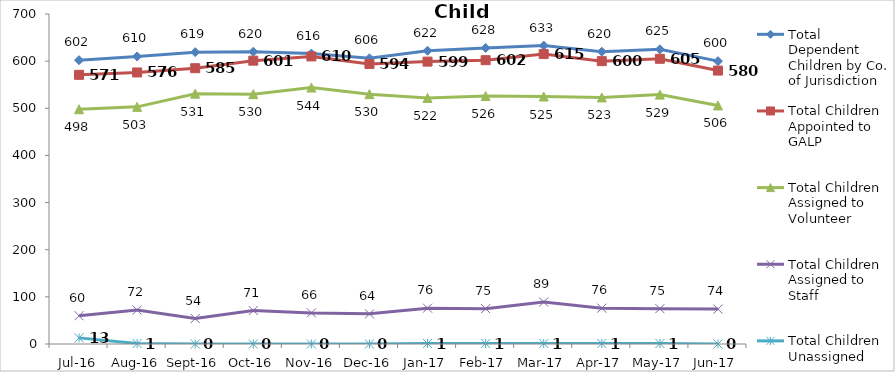
| Category | Total Dependent Children by Co. of Jurisdiction | Total Children Appointed to GALP | Total Children Assigned to Volunteer | Total Children Assigned to Staff | Total Children Unassigned |
|---|---|---|---|---|---|
| Jul-16 | 602 | 571 | 498 | 60 | 13 |
| Aug-16 | 610 | 576 | 503 | 72 | 1 |
| Sep-16 | 619 | 585 | 531 | 54 | 0 |
| Oct-16 | 620 | 601 | 530 | 71 | 0 |
| Nov-16 | 616 | 610 | 544 | 66 | 0 |
| Dec-16 | 606 | 594 | 530 | 64 | 0 |
| Jan-17 | 622 | 599 | 522 | 76 | 1 |
| Feb-17 | 628 | 602 | 526 | 75 | 1 |
| Mar-17 | 633 | 615 | 525 | 89 | 1 |
| Apr-17 | 620 | 600 | 523 | 76 | 1 |
| May-17 | 625 | 605 | 529 | 75 | 1 |
| Jun-17 | 600 | 580 | 506 | 74 | 0 |